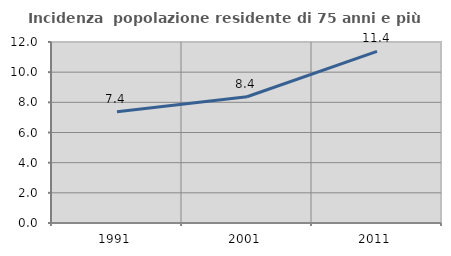
| Category | Incidenza  popolazione residente di 75 anni e più |
|---|---|
| 1991.0 | 7.378 |
| 2001.0 | 8.369 |
| 2011.0 | 11.384 |